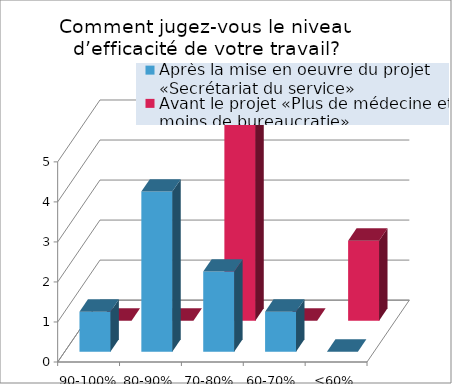
| Category | Après la mise en oeuvre du projet «Secrétariat du service» | Avant le projet «Plus de médecine et moins de bureaucratie» |
|---|---|---|
| 90-100% | 1 | 0 |
| 80-90% | 4 | 0 |
| 70-80% | 2 | 5 |
| 60-70% | 1 | 0 |
| <60% | 0 | 2 |